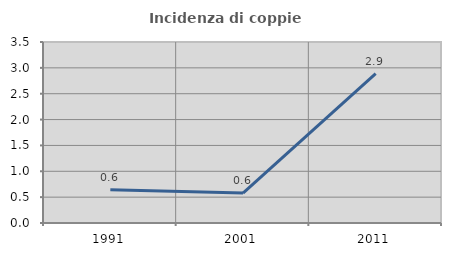
| Category | Incidenza di coppie miste |
|---|---|
| 1991.0 | 0.645 |
| 2001.0 | 0.578 |
| 2011.0 | 2.89 |